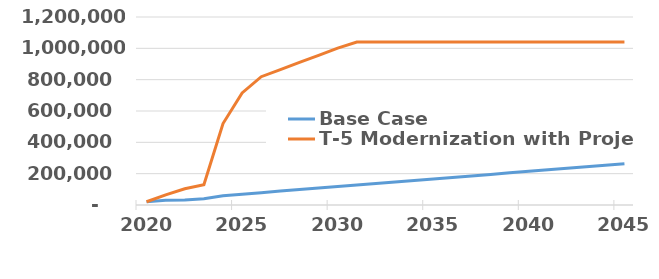
| Category |  Base Case  |  T-5 Modernization with Project  |
|---|---|---|
| 2020.0 | 20704 | 20704 |
| 2021.0 | 30409 | 65000 |
| 2022.0 | 32091.2 | 104000 |
| 2023.0 | 39855.2 | 130000 |
| 2024.0 | 59524 | 520000 |
| 2025.0 | 69229 | 715000 |
| 2026.0 | 78934 | 819000 |
| 2027.0 | 88639 | 864500 |
| 2028.0 | 98344 | 910000 |
| 2029.0 | 108049 | 955500 |
| 2030.0 | 117754 | 1001000 |
| 2031.0 | 127459 | 1040000 |
| 2032.0 | 137164 | 1040000 |
| 2033.0 | 146869 | 1040000 |
| 2034.0 | 156574 | 1040000 |
| 2035.0 | 166279 | 1040000 |
| 2036.0 | 175984 | 1040000 |
| 2037.0 | 185689 | 1040000 |
| 2038.0 | 195394 | 1040000 |
| 2039.0 | 205099 | 1040000 |
| 2040.0 | 214804 | 1040000 |
| 2041.0 | 224509 | 1040000 |
| 2042.0 | 234214 | 1040000 |
| 2043.0 | 243919 | 1040000 |
| 2044.0 | 253624 | 1040000 |
| 2045.0 | 263329 | 1040000 |